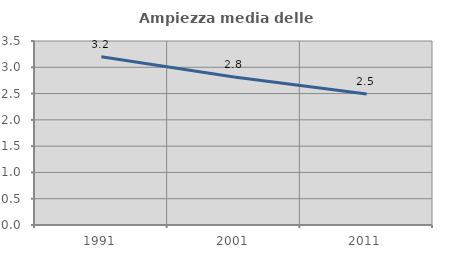
| Category | Ampiezza media delle famiglie |
|---|---|
| 1991.0 | 3.201 |
| 2001.0 | 2.815 |
| 2011.0 | 2.492 |